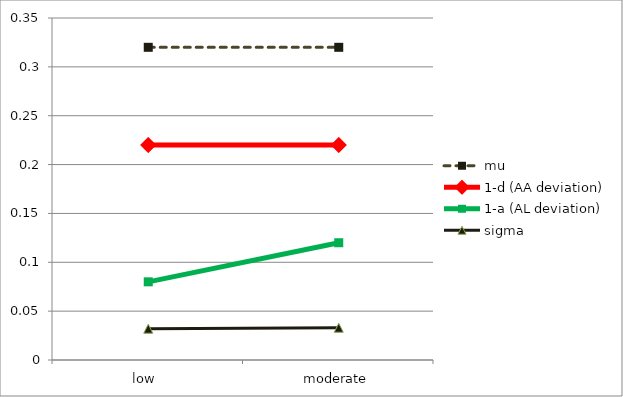
| Category | mu | 1-d (AA deviation) | 1-a (AL deviation) | sigma |
|---|---|---|---|---|
| low  | 0.32 | 0.22 | 0.08 | 0.032 |
| moderate | 0.32 | 0.22 | 0.12 | 0.033 |